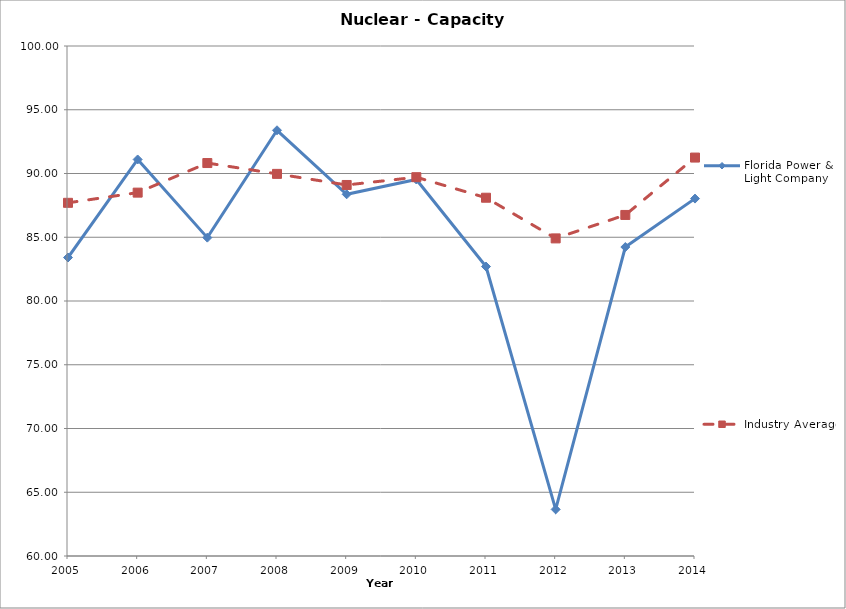
| Category | Florida Power & Light Company | Industry Average |
|---|---|---|
| 2005.0 | 83.41 | 87.7 |
| 2006.0 | 91.1 | 88.5 |
| 2007.0 | 84.97 | 90.82 |
| 2008.0 | 93.39 | 89.97 |
| 2009.0 | 88.37 | 89.1 |
| 2010.0 | 89.53 | 89.71 |
| 2011.0 | 82.702 | 88.1 |
| 2012.0 | 63.655 | 84.91 |
| 2013.0 | 84.232 | 86.75 |
| 2014.0 | 88.032 | 91.25 |